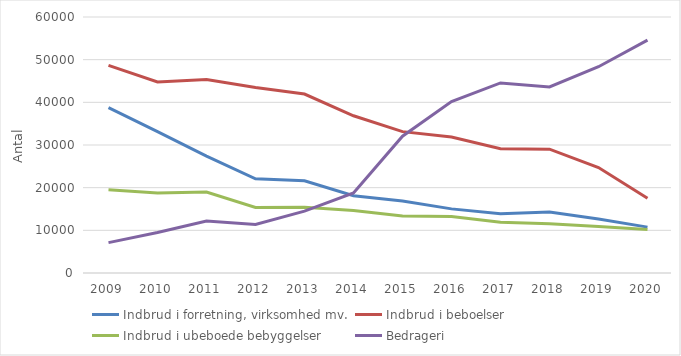
| Category | Indbrud i forretning, virksomhed mv. | Indbrud i beboelser | Indbrud i ubeboede bebyggelser | Bedrageri |
|---|---|---|---|---|
| 2009 | 38778 | 48670 | 19524 | 7114 |
| 2010 | 33149 | 44788 | 18746 | 9499 |
| 2011 | 27401 | 45369 | 18962 | 12167 |
| 2012 | 22072 | 43480 | 15378 | 11392 |
| 2013 | 21623 | 41946 | 15386 | 14510 |
| 2014 | 18118 | 36852 | 14667 | 18769 |
| 2015 | 16872 | 33129 | 13342 | 32062 |
| 2016 | 15029 | 31885 | 13222 | 40188 |
| 2017 | 13863 | 29147 | 11912 | 44550 |
| 2018 | 14318 | 29015 | 11535 | 43617 |
| 2019 | 12635 | 24705 | 10917 | 48348 |
| 2020 | 10754 | 17529 | 10210 | 54583 |